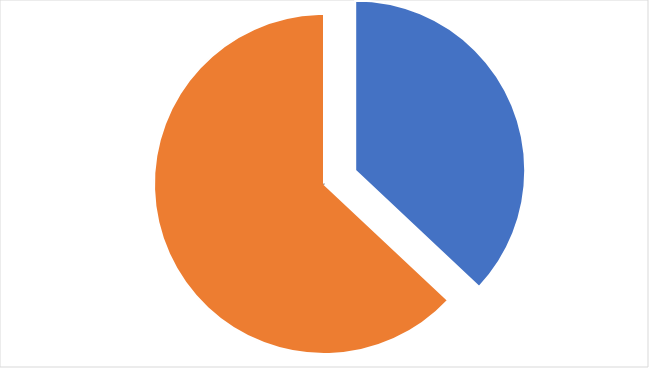
| Category | Series 0 |
|---|---|
| 0 | 0.37 |
| 1 | 0.63 |